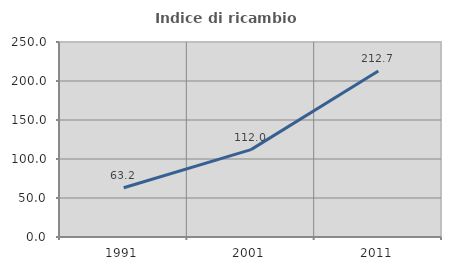
| Category | Indice di ricambio occupazionale  |
|---|---|
| 1991.0 | 63.19 |
| 2001.0 | 112.022 |
| 2011.0 | 212.717 |